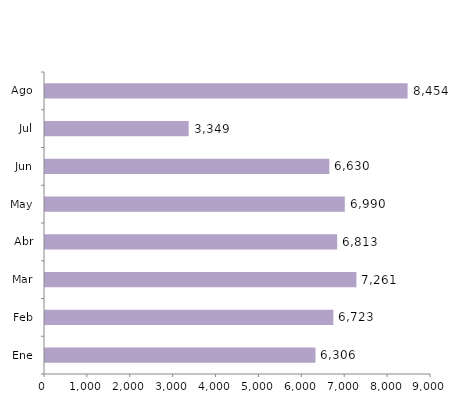
| Category | Series 0 |
|---|---|
| Ene | 6306 |
| Feb | 6723 |
| Mar | 7261 |
| Abr | 6813 |
| May | 6990 |
| Jun | 6630 |
| Jul | 3349 |
| Ago | 8454 |